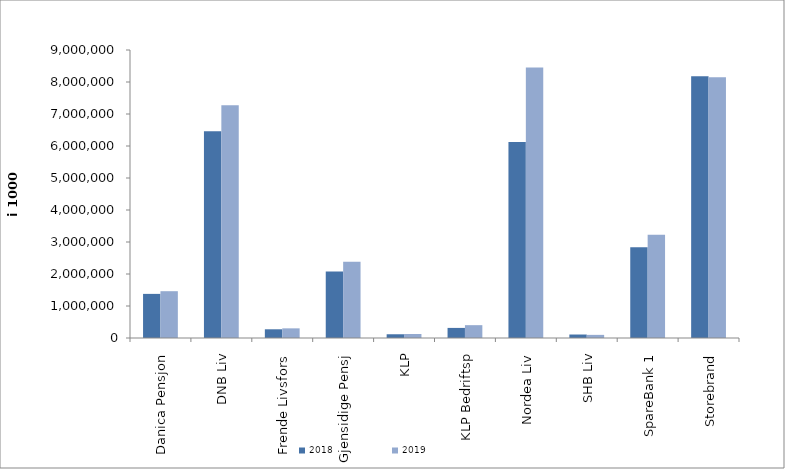
| Category | 2018 | 2019 |
|---|---|---|
| Danica Pensjon | 1378607.102 | 1462527.36 |
| DNB Liv | 6459699 | 7274914.47 |
| Frende Livsfors | 272300 | 301589 |
| Gjensidige Pensj | 2075074 | 2383693 |
| KLP | 116827.63 | 125663.209 |
| KLP Bedriftsp | 315306 | 401210 |
| Nordea Liv | 6126379.012 | 8452097.989 |
| SHB Liv | 108843 | 97840.429 |
| SpareBank 1 | 2837915.873 | 3230081.036 |
| Storebrand | 8177309.654 | 8147311.87 |